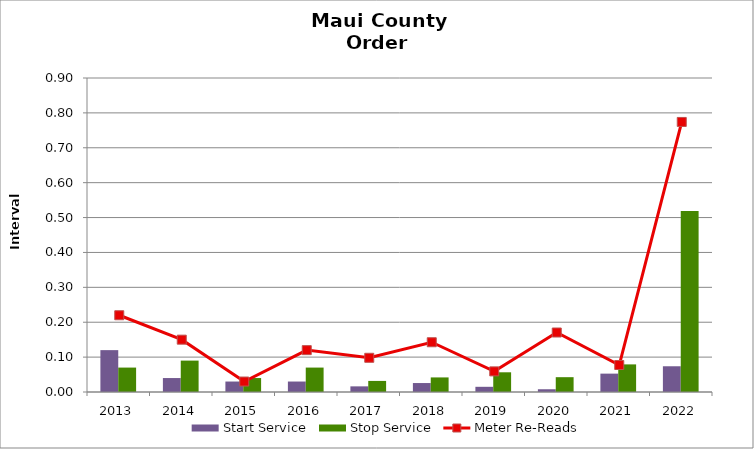
| Category | Start Service | Stop Service |
|---|---|---|
| 2013.0 | 0.12 | 0.07 |
| 2014.0 | 0.04 | 0.09 |
| 2015.0 | 0.03 | 0.04 |
| 2016.0 | 0.03 | 0.07 |
| 2017.0 | 0.016 | 0.032 |
| 2018.0 | 0.026 | 0.042 |
| 2019.0 | 0.015 | 0.056 |
| 2020.0 | 0.008 | 0.042 |
| 2021.0 | 0.053 | 0.079 |
| 2022.0 | 0.074 | 0.519 |